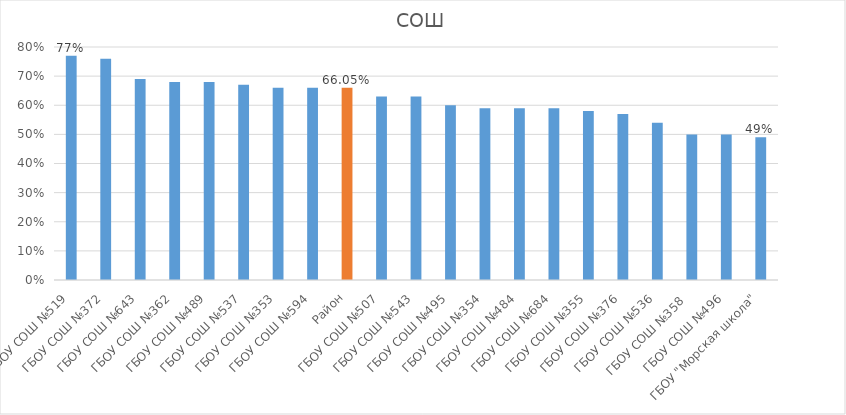
| Category | Series 0 |
|---|---|
| ГБОУ СОШ №519 | 0.77 |
| ГБОУ СОШ №372 | 0.76 |
| ГБОУ СОШ №643 | 0.69 |
| ГБОУ СОШ №362 | 0.68 |
| ГБОУ СОШ №489 | 0.68 |
| ГБОУ СОШ №537 | 0.67 |
| ГБОУ СОШ №353 | 0.66 |
| ГБОУ СОШ №594 | 0.66 |
| Район | 0.66 |
| ГБОУ СОШ №507 | 0.63 |
| ГБОУ СОШ №543 | 0.63 |
| ГБОУ СОШ №495 | 0.6 |
| ГБОУ СОШ №354 | 0.59 |
| ГБОУ СОШ №484 | 0.59 |
| ГБОУ СОШ №684 | 0.59 |
| ГБОУ СОШ №355 | 0.58 |
| ГБОУ СОШ №376 | 0.57 |
| ГБОУ СОШ №536 | 0.54 |
| ГБОУ СОШ №358  | 0.5 |
| ГБОУ СОШ №496 | 0.5 |
| ГБОУ "Морская школа" | 0.49 |